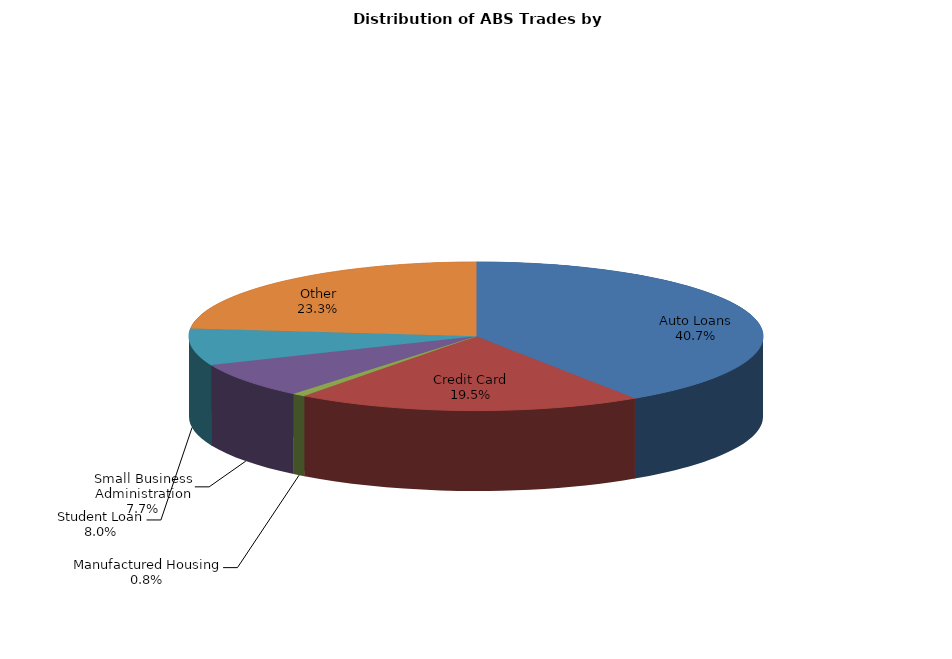
| Category | Series 0 |
|---|---|
| Auto Loans | 155.29 |
| Credit Card | 74.504 |
| Manufactured Housing | 2.937 |
| Small Business Administration | 29.452 |
| Student Loan | 30.571 |
| Other | 89.052 |